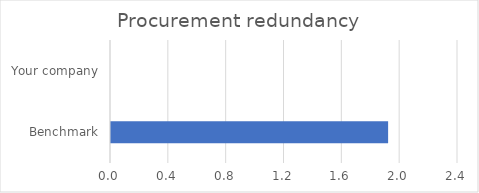
| Category | Procurement redundancy |
|---|---|
| Benchmark | 1.917 |
| Your company | 0 |